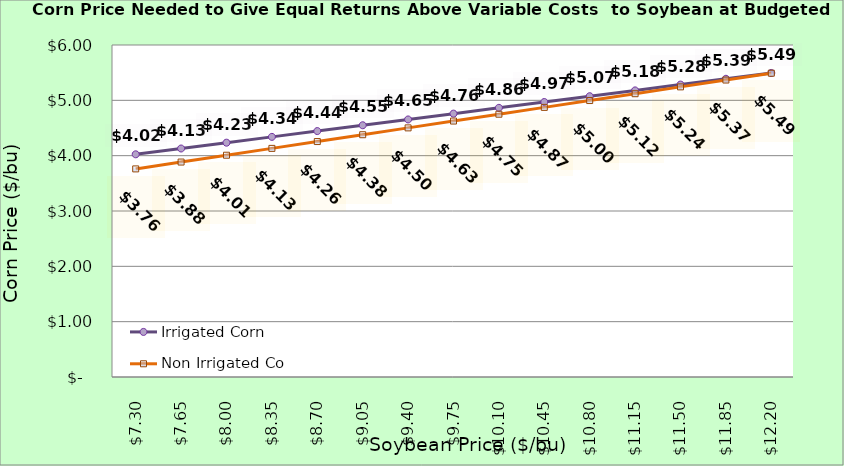
| Category | Irrigated Corn | Non Irrigated Corn |
|---|---|---|
| 7.3000000000000025 | 4.025 | 3.761 |
| 7.650000000000002 | 4.13 | 3.884 |
| 8.000000000000002 | 4.235 | 4.008 |
| 8.350000000000001 | 4.34 | 4.132 |
| 8.700000000000001 | 4.445 | 4.255 |
| 9.05 | 4.55 | 4.379 |
| 9.4 | 4.655 | 4.502 |
| 9.75 | 4.76 | 4.626 |
| 10.1 | 4.865 | 4.749 |
| 10.45 | 4.97 | 4.873 |
| 10.799999999999999 | 5.075 | 4.996 |
| 11.149999999999999 | 5.18 | 5.12 |
| 11.499999999999998 | 5.285 | 5.243 |
| 11.849999999999998 | 5.39 | 5.367 |
| 12.199999999999998 | 5.495 | 5.49 |